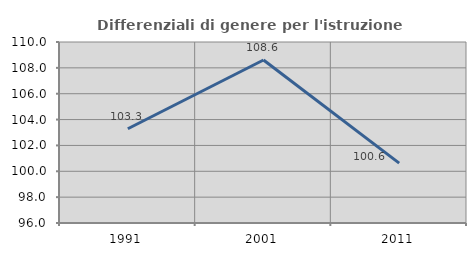
| Category | Differenziali di genere per l'istruzione superiore |
|---|---|
| 1991.0 | 103.291 |
| 2001.0 | 108.608 |
| 2011.0 | 100.627 |